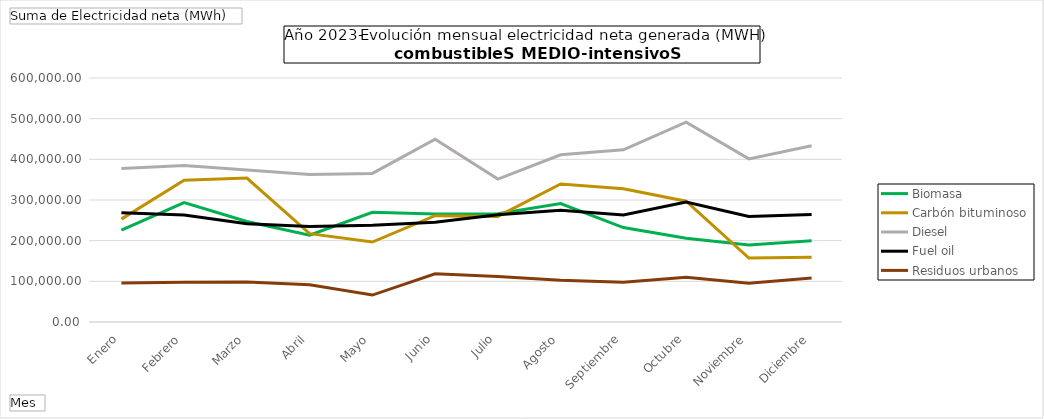
| Category | Biomasa | Carbón bituminoso | Diesel | Fuel oil | Residuos urbanos |
|---|---|---|---|---|---|
| Enero | 225650.89 | 253021.99 | 377247.66 | 268914.23 | 96076.5 |
| Febrero | 293677.18 | 348857.88 | 385020.23 | 263077.72 | 97495.62 |
| Marzo | 247108.64 | 353844.62 | 373879.18 | 241677.61 | 98558.93 |
| Abril | 213387.66 | 217226.24 | 362439.3 | 234666.16 | 91491.58 |
| Mayo | 269773.6 | 196544.3 | 365350.46 | 237945.44 | 66267.43 |
| Junio | 265310.97 | 261293.27 | 449522.27 | 245583.19 | 118432.86 |
| Julio | 266120.03 | 259724.42 | 351395.74 | 263650.73 | 111920.01 |
| Agosto | 291353.08 | 339328.8 | 411273.77 | 274553.83 | 102760.14 |
| Septiembre | 232135.87 | 327717.24 | 423528.2 | 263356.86 | 97518.39 |
| Octubre | 206016.85 | 297036.82 | 491429.35 | 294758.69 | 109858.17 |
| Noviembre | 189576.35 | 157372.52 | 401165.47 | 259559.24 | 95178.1 |
| Diciembre | 199666.96 | 159425.2 | 433319.51 | 264349.9 | 108096.41 |